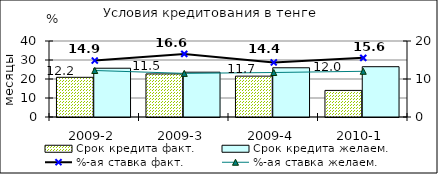
| Category | Срок кредита факт.  | Срок кредита желаем. |
|---|---|---|
| 2009-2 | 20.89 | 25.67 |
| 2009-3 | 22.67 | 23.58 |
| 2009-4 | 21.5 | 25.91 |
| 2010-1 | 14 | 26.48 |